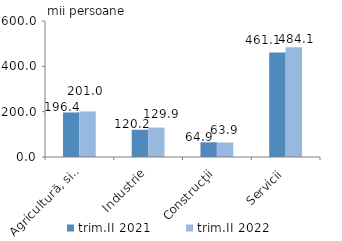
| Category | trim.II 2021 | trim.II 2022 |
|---|---|---|
| Agricultură, silvicultură şi pescuit | 196.42 | 200.963 |
| Industrie | 120.181 | 129.905 |
| Construcţii | 64.949 | 63.869 |
| Servicii | 461.058 | 484.129 |